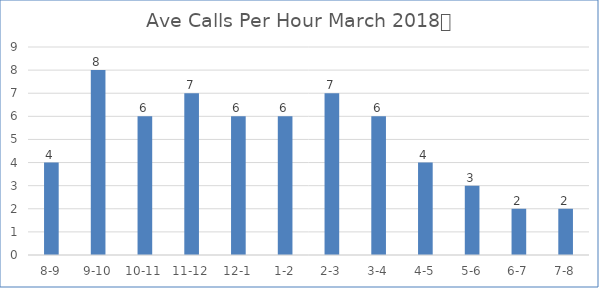
| Category | Ave Calls Per Hour |
|---|---|
| 8-9 | 4 |
| 9-10 | 8 |
| 10-11 | 6 |
| 11-12 | 7 |
| 12-1 | 6 |
| 1-2 | 6 |
| 2-3 | 7 |
| 3-4 | 6 |
| 4-5 | 4 |
| 5-6 | 3 |
| 6-7 | 2 |
| 7-8 | 2 |